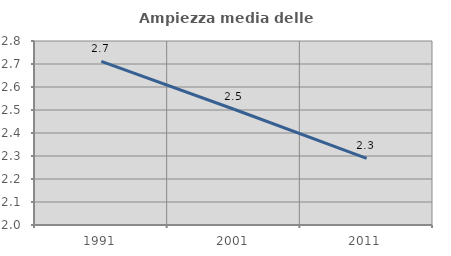
| Category | Ampiezza media delle famiglie |
|---|---|
| 1991.0 | 2.712 |
| 2001.0 | 2.503 |
| 2011.0 | 2.29 |